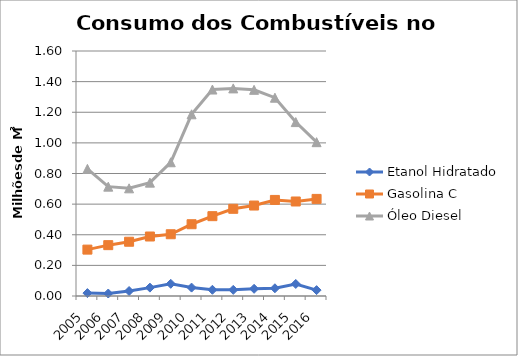
| Category | Etanol Hidratado | Gasolina C | Óleo Diesel |
|---|---|---|---|
| 2005.0 | 19016.005 | 302865.598 | 830160.4 |
| 2006.0 | 16265.73 | 332061.528 | 714176.548 |
| 2007.0 | 32504.389 | 354301.334 | 703212.089 |
| 2008.0 | 54703.033 | 388553.26 | 740401.067 |
| 2009.0 | 79600.729 | 403312.309 | 873379.423 |
| 2010.0 | 54875.694 | 468688.196 | 1186647.67 |
| 2011.0 | 40517.314 | 521355.097 | 1348311.495 |
| 2012.0 | 40069.263 | 569396.746 | 1355732.353 |
| 2013.0 | 47011.25 | 590749.207 | 1346465.119 |
| 2014.0 | 50438.877 | 627353.968 | 1294935.9 |
| 2015.0 | 78600.587 | 617203.43 | 1135760.099 |
| 2016.0 | 38370.906 | 634172.722 | 1004600.787 |